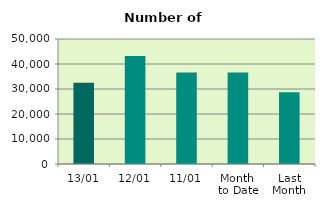
| Category | Series 0 |
|---|---|
| 13/01 | 32540 |
| 12/01 | 43208 |
| 11/01 | 36648 |
| Month 
to Date | 36621.556 |
| Last
Month | 28724.435 |